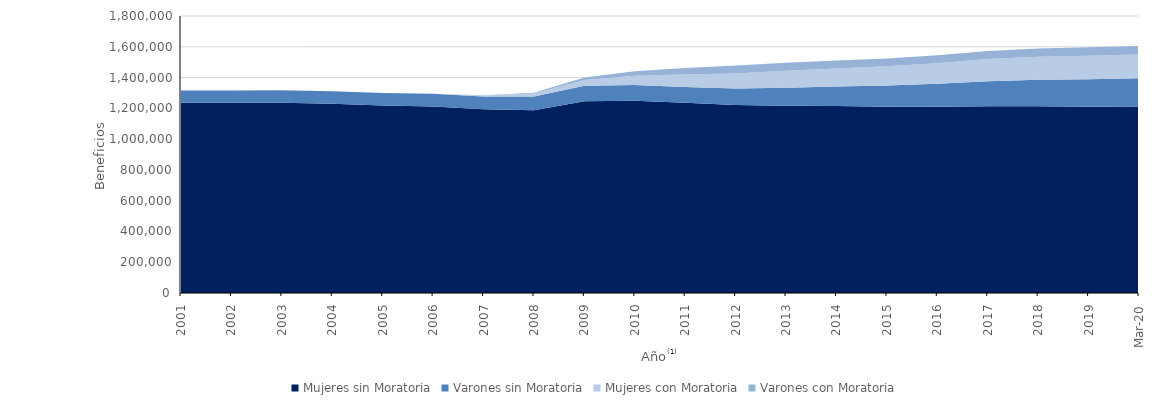
| Category | Mujeres sin Moratoria | Varones sin Moratoria | Mujeres con Moratoria | Varones con Moratoria |
|---|---|---|---|---|
| 2001.0 | 1236301 | 79423 | 0 | 0 |
| 2002.0 | 1236138 | 80285 | 0 | 0 |
| 2003.0 | 1236305 | 81417 | 0 | 0 |
| 2004.0 | 1229040 | 81634 | 0 | 0 |
| 2005.0 | 1218499 | 81327 | 0 | 0 |
| 2006.0 | 1212170 | 81822 | 419 | 146 |
| 2007.0 | 1194288 | 83336 | 6092 | 1253 |
| 2008.0 | 1187045 | 89283 | 19492 | 5319 |
| 2009.0 | 1246291 | 100035 | 38518 | 16237 |
| 2010.0 | 1248876 | 102018 | 60609 | 29916 |
| 2011.0 | 1236359 | 102901 | 80002 | 42327 |
| 2012.0 | 1222328 | 107031 | 97750 | 50776 |
| 2013.0 | 1217015 | 116952 | 109834 | 52733 |
| 2014.0 | 1214383 | 127530 | 117496 | 52190 |
| 2015.0 | 1211094 | 137965 | 123770 | 50916 |
| 2016.0 | 1210485 | 149147 | 133805 | 50824 |
| 2017.0 | 1214208 | 162135 | 144278 | 52379 |
| 2018.0 | 1213855 | 171512 | 149487 | 53646 |
| 2019.0 | 1210688 | 178537 | 152436 | 54513 |
| 43891.0 | 1211199 | 184143 | 154246 | 55356 |